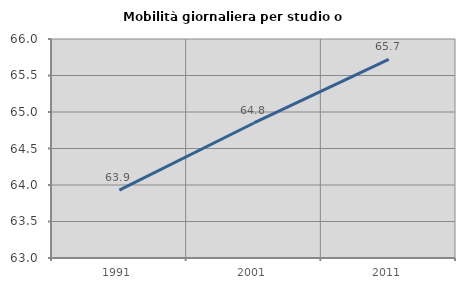
| Category | Mobilità giornaliera per studio o lavoro |
|---|---|
| 1991.0 | 63.931 |
| 2001.0 | 64.85 |
| 2011.0 | 65.722 |